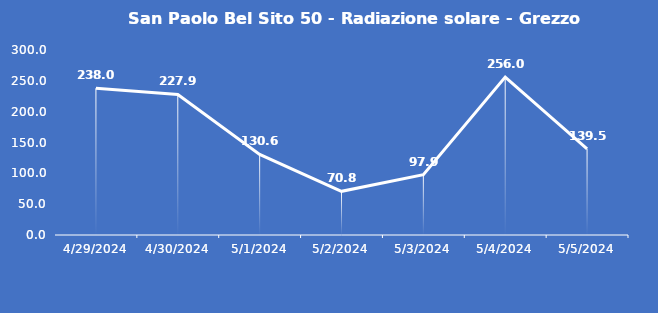
| Category | San Paolo Bel Sito 50 - Radiazione solare - Grezzo (W/m2) |
|---|---|
| 4/29/24 | 238 |
| 4/30/24 | 227.9 |
| 5/1/24 | 130.6 |
| 5/2/24 | 70.8 |
| 5/3/24 | 97.9 |
| 5/4/24 | 256 |
| 5/5/24 | 139.5 |